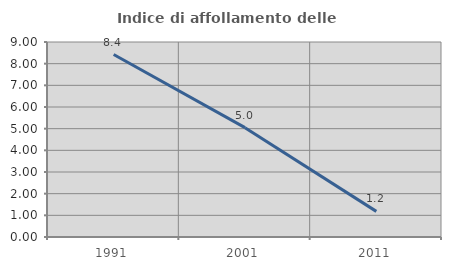
| Category | Indice di affollamento delle abitazioni  |
|---|---|
| 1991.0 | 8.421 |
| 2001.0 | 5.047 |
| 2011.0 | 1.182 |